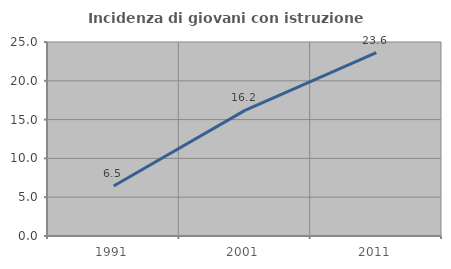
| Category | Incidenza di giovani con istruzione universitaria |
|---|---|
| 1991.0 | 6.452 |
| 2001.0 | 16.19 |
| 2011.0 | 23.636 |